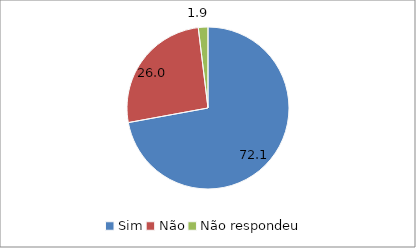
| Category | Series 0 |
|---|---|
| Sim | 72.115 |
| Não | 25.962 |
| Não respondeu | 1.923 |